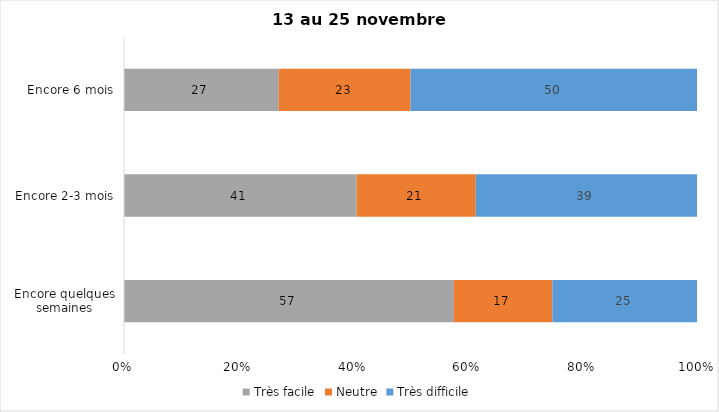
| Category | Très facile | Neutre | Très difficile |
|---|---|---|---|
| Encore quelques semaines | 57 | 17 | 25 |
| Encore 2-3 mois | 41 | 21 | 39 |
| Encore 6 mois | 27 | 23 | 50 |